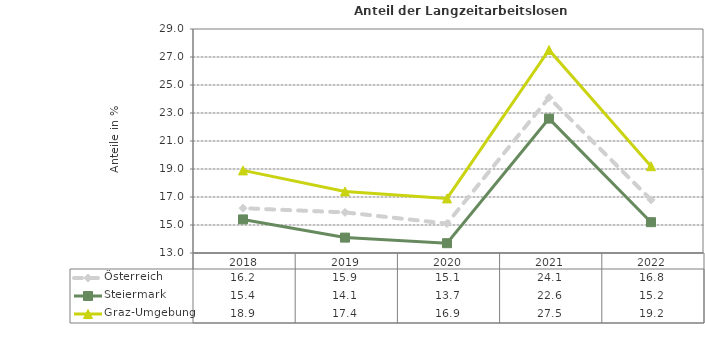
| Category | Österreich | Steiermark | Graz-Umgebung |
|---|---|---|---|
| 2022.0 | 16.8 | 15.2 | 19.2 |
| 2021.0 | 24.1 | 22.6 | 27.5 |
| 2020.0 | 15.1 | 13.7 | 16.9 |
| 2019.0 | 15.9 | 14.1 | 17.4 |
| 2018.0 | 16.2 | 15.4 | 18.9 |